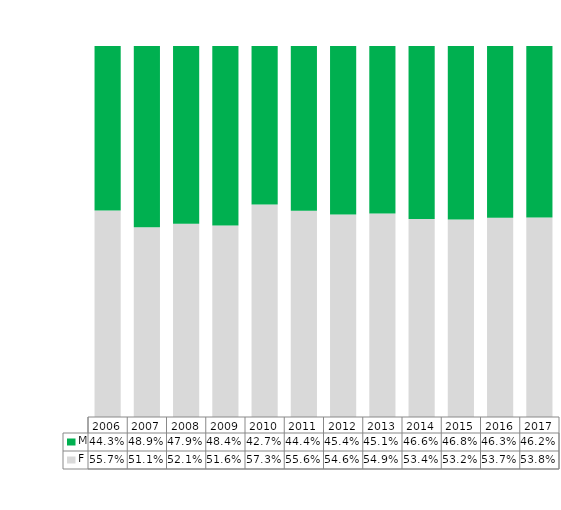
| Category | F | M |
|---|---|---|
| 2006.0 | 0.557 | 0.443 |
| 2007.0 | 0.511 | 0.489 |
| 2008.0 | 0.521 | 0.479 |
| 2009.0 | 0.516 | 0.484 |
| 2010.0 | 0.573 | 0.427 |
| 2011.0 | 0.556 | 0.444 |
| 2012.0 | 0.546 | 0.454 |
| 2013.0 | 0.549 | 0.451 |
| 2014.0 | 0.534 | 0.466 |
| 2015.0 | 0.532 | 0.468 |
| 2016.0 | 0.537 | 0.463 |
| 2017.0 | 0.538 | 0.462 |